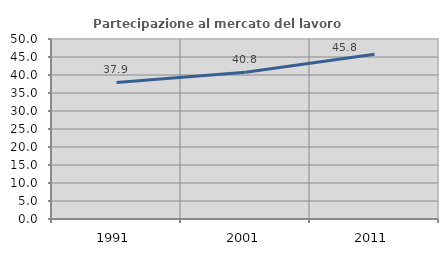
| Category | Partecipazione al mercato del lavoro  femminile |
|---|---|
| 1991.0 | 37.945 |
| 2001.0 | 40.792 |
| 2011.0 | 45.751 |